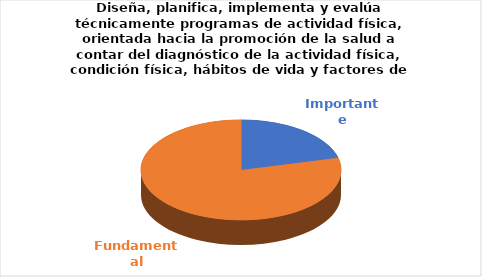
| Category | Series 0 |
|---|---|
| Importante | 4 |
| Fundamental | 15 |